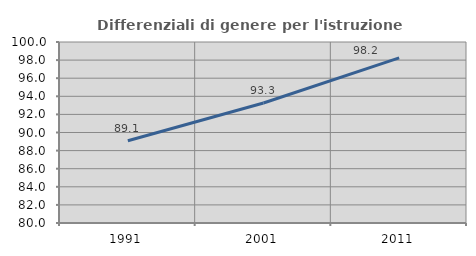
| Category | Differenziali di genere per l'istruzione superiore |
|---|---|
| 1991.0 | 89.082 |
| 2001.0 | 93.262 |
| 2011.0 | 98.238 |